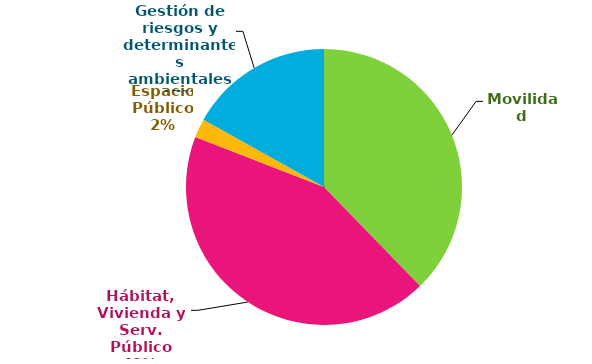
| Category | Público |
|---|---|
| Movilidad | 1.583 |
| Hábitat, Vivienda y Serv. Público | 1.81 |
| Espacio Público | 0.093 |
| Gestión de riesgos y determinantes ambientales | 0.708 |